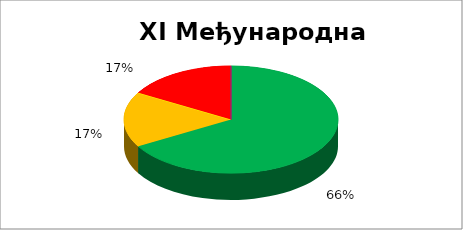
| Category | XI Међународна сарадња |
|---|---|
| 0 | 0.667 |
| 1 | 0.167 |
| 2 | 0 |
| 3 | 0.167 |
| 4 | 0 |